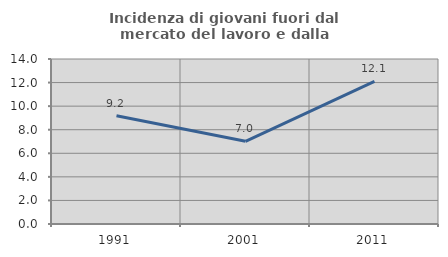
| Category | Incidenza di giovani fuori dal mercato del lavoro e dalla formazione  |
|---|---|
| 1991.0 | 9.189 |
| 2001.0 | 7.018 |
| 2011.0 | 12.105 |